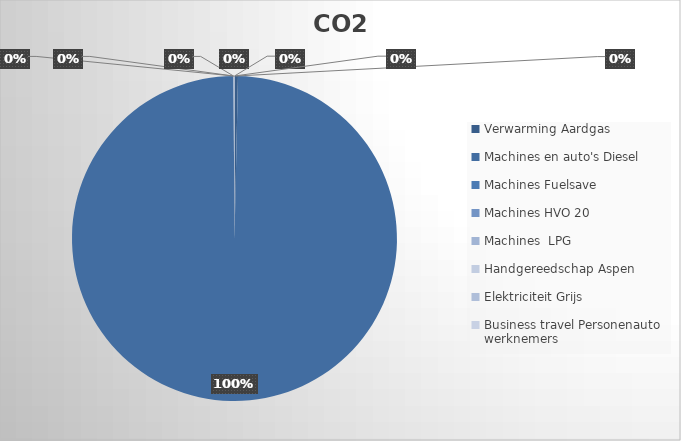
| Category | Ton CO2 | Series 1 |
|---|---|---|
| 0 | 2.26 |  |
| 1 | 658.379 |  |
| 2 | 0 |  |
| 3 | 0 |  |
| 4 | 0 |  |
| 5 | 0.635 |  |
| 6 | 0 |  |
| 7 | 0 |  |